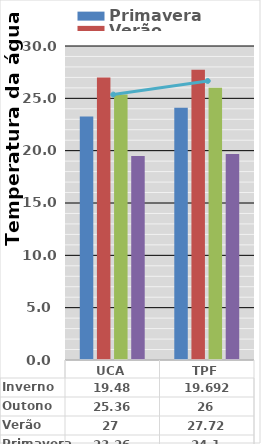
| Category | Primavera | Verão | Outono | Inverno |
|---|---|---|---|---|
| UCA | 23.26 | 27 | 25.36 | 19.48 |
| TPF | 24.1 | 27.72 | 26 | 19.692 |